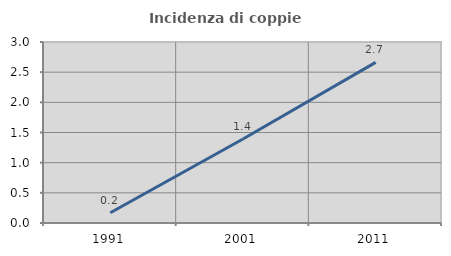
| Category | Incidenza di coppie miste |
|---|---|
| 1991.0 | 0.171 |
| 2001.0 | 1.393 |
| 2011.0 | 2.662 |